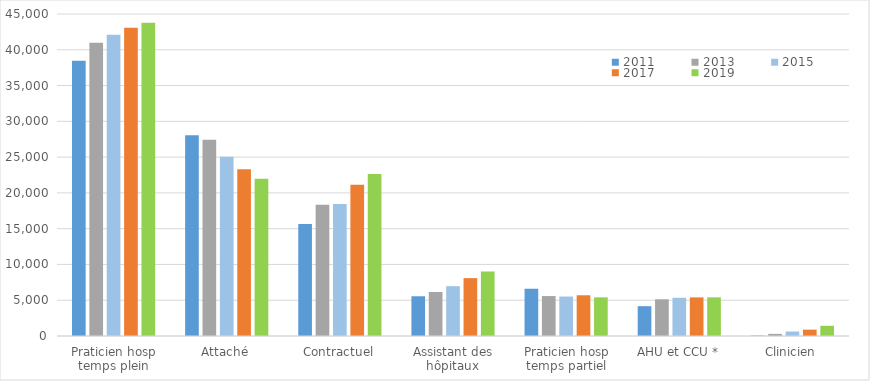
| Category | 2011 | 2013 | 2015 | 2017 | 2019 |
|---|---|---|---|---|---|
| Praticien hosp
temps plein | 38452 | 40983 | 42103 | 43061 | 43773 |
| Attaché | 28059 | 27430 | 25033 | 23292 | 21993 |
| Contractuel | 15638 | 18352 | 18451 | 21151 | 22637 |
| Assistant des hôpitaux | 5556 | 6152 | 6961 | 8086 | 9022 |
| Praticien hosp
temps partiel | 6605 | 5583 | 5515 | 5693 | 5403 |
| AHU et CCU * | 4167 | 5128 | 5342 | 5396 | 5403 |
| Clinicien | 58 | 293 | 625 | 889 | 1428 |